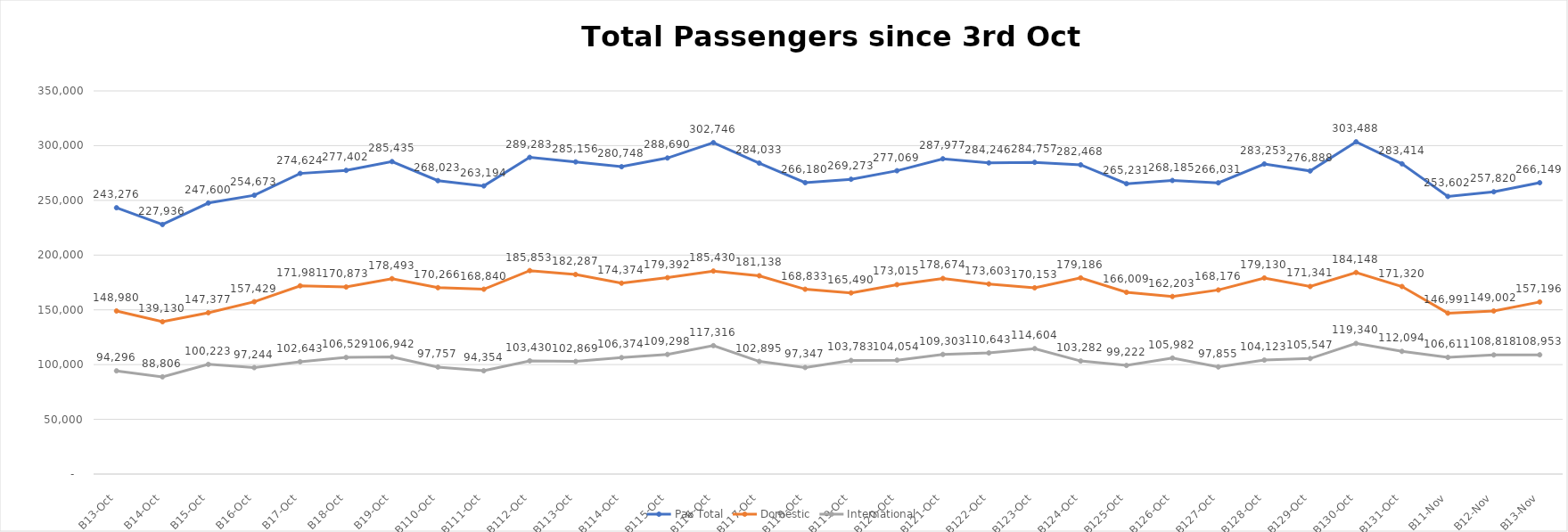
| Category | Pax Total |  Domestic  |  International  |
|---|---|---|---|
| 2022-10-03 | 243276 | 148980 | 94296 |
| 2022-10-04 | 227936 | 139130 | 88806 |
| 2022-10-05 | 247600 | 147377 | 100223 |
| 2022-10-06 | 254673 | 157429 | 97244 |
| 2022-10-07 | 274624 | 171981 | 102643 |
| 2022-10-08 | 277402 | 170873 | 106529 |
| 2022-10-09 | 285435 | 178493 | 106942 |
| 2022-10-10 | 268023 | 170266 | 97757 |
| 2022-10-11 | 263194 | 168840 | 94354 |
| 2022-10-12 | 289283 | 185853 | 103430 |
| 2022-10-13 | 285156 | 182287 | 102869 |
| 2022-10-14 | 280748 | 174374 | 106374 |
| 2022-10-15 | 288690 | 179392 | 109298 |
| 2022-10-16 | 302746 | 185430 | 117316 |
| 2022-10-17 | 284033 | 181138 | 102895 |
| 2022-10-18 | 266180 | 168833 | 97347 |
| 2022-10-19 | 269273 | 165490 | 103783 |
| 2022-10-20 | 277069 | 173015 | 104054 |
| 2022-10-21 | 287977 | 178674 | 109303 |
| 2022-10-22 | 284246 | 173603 | 110643 |
| 2022-10-23 | 284757 | 170153 | 114604 |
| 2022-10-24 | 282468 | 179186 | 103282 |
| 2022-10-25 | 265231 | 166009 | 99222 |
| 2022-10-26 | 268185 | 162203 | 105982 |
| 2022-10-27 | 266031 | 168176 | 97855 |
| 2022-10-28 | 283253 | 179130 | 104123 |
| 2022-10-29 | 276888 | 171341 | 105547 |
| 2022-10-30 | 303488 | 184148 | 119340 |
| 2022-10-31 | 283414 | 171320 | 112094 |
| 2022-11-01 | 253602 | 146991 | 106611 |
| 2022-11-02 | 257820 | 149002 | 108818 |
| 2022-11-03 | 266149 | 157196 | 108953 |